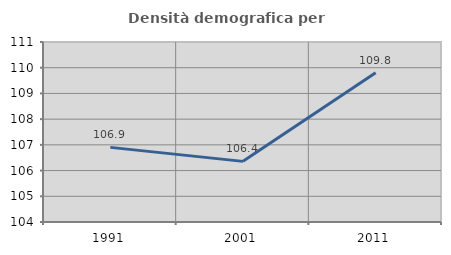
| Category | Densità demografica |
|---|---|
| 1991.0 | 106.902 |
| 2001.0 | 106.358 |
| 2011.0 | 109.806 |